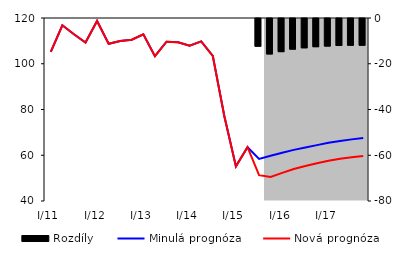
| Category | Rozdíly |
|---|---|
| 0 | 0 |
| 1 | 0 |
| 2 | 0 |
| 3 | 0 |
| 4 | 0 |
| 5 | 0 |
| 6 | 0 |
| 7 | 0 |
| 8 | 0 |
| 9 | 0 |
| 10 | 0 |
| 11 | 0 |
| 12 | 0 |
| 13 | 0 |
| 14 | 0 |
| 15 | 0 |
| 16 | 0 |
| 17 | 0 |
| 18 | -12.112 |
| 19 | -15.487 |
| 20 | -14.481 |
| 21 | -13.39 |
| 22 | -12.798 |
| 23 | -12.321 |
| 24 | -12.039 |
| 25 | -11.815 |
| 26 | -11.69 |
| 27 | -11.685 |